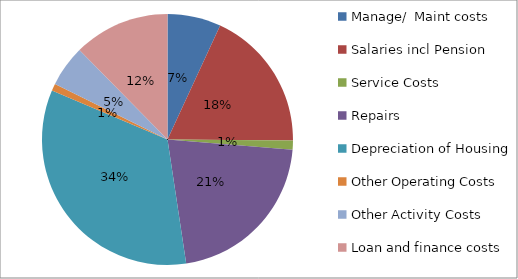
| Category | Series 0 |
|---|---|
| Manage/  Maint costs | 0.069 |
| Salaries incl Pension | 0.182 |
| Service Costs | 0.012 |
| Repairs | 0.213 |
| Depreciation of Housing | 0.338 |
| Other Operating Costs | 0.009 |
| Other Activity Costs | 0.053 |
| Loan and finance costs | 0.124 |